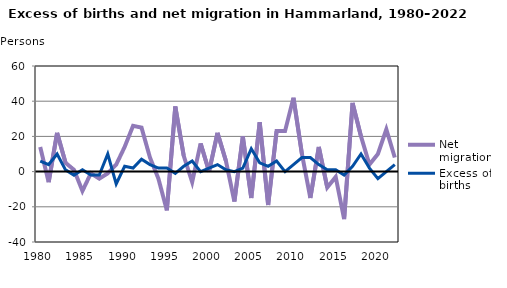
| Category | Net migration | Excess of births |
|---|---|---|
| 1980.0 | 14 | 6 |
| 1981.0 | -6 | 4 |
| 1982.0 | 22 | 10 |
| 1983.0 | 5 | 1 |
| 1984.0 | 1 | -2 |
| 1985.0 | -11 | 1 |
| 1986.0 | -1 | -2 |
| 1987.0 | -4 | -2 |
| 1988.0 | -1 | 10 |
| 1989.0 | 4 | -7 |
| 1990.0 | 14 | 3 |
| 1991.0 | 26 | 2 |
| 1992.0 | 25 | 7 |
| 1993.0 | 8 | 4 |
| 1994.0 | -4 | 2 |
| 1995.0 | -22 | 2 |
| 1996.0 | 37 | -1 |
| 1997.0 | 9 | 3 |
| 1998.0 | -6 | 6 |
| 1999.0 | 16 | 0 |
| 2000.0 | 0 | 2 |
| 2001.0 | 22 | 4 |
| 2002.0 | 6 | 1 |
| 2003.0 | -17 | 0 |
| 2004.0 | 20 | 2 |
| 2005.0 | -15 | 13 |
| 2006.0 | 28 | 5 |
| 2007.0 | -19 | 3 |
| 2008.0 | 23 | 6 |
| 2009.0 | 23 | 0 |
| 2010.0 | 42 | 4 |
| 2011.0 | 10 | 8 |
| 2012.0 | -15 | 8 |
| 2013.0 | 14 | 4 |
| 2014.0 | -9 | 1 |
| 2015.0 | -3 | 1 |
| 2016.0 | -27 | -2 |
| 2017.0 | 39 | 3 |
| 2018.0 | 20 | 10 |
| 2019.0 | 4 | 2 |
| 2020.0 | 10 | -4 |
| 2021.0 | 24 | 0 |
| 2022.0 | 8 | 4 |